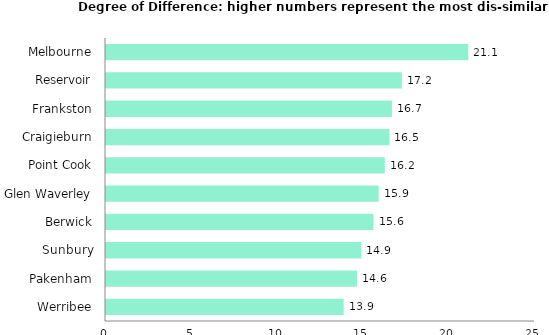
| Category | Series 0 |
|---|---|
| Werribee | 13.851 |
| Pakenham | 14.623 |
| Sunbury | 14.881 |
| Berwick | 15.589 |
| Glen Waverley | 15.889 |
| Point Cook | 16.244 |
| Craigieburn | 16.519 |
| Frankston | 16.662 |
| Reservoir | 17.238 |
| Melbourne | 21.111 |